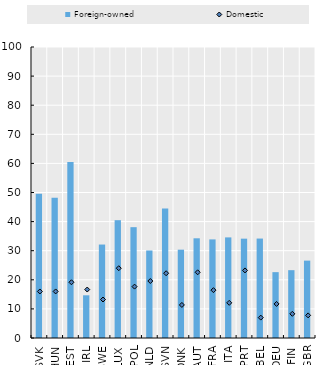
| Category | Foreign-owned |
|---|---|
| SVK | 49.602 |
| HUN | 48.227 |
| EST | 60.465 |
| IRL | 14.674 |
| SWE | 32.116 |
| LUX | 40.484 |
| POL | 38.085 |
| NLD | 30.076 |
| SVN | 44.472 |
| DNK | 30.354 |
| AUT | 34.265 |
| FRA | 33.884 |
| ITA | 34.573 |
| PRT | 34.137 |
| BEL | 34.172 |
| DEU | 22.63 |
| FIN | 23.309 |
| GBR | 26.59 |